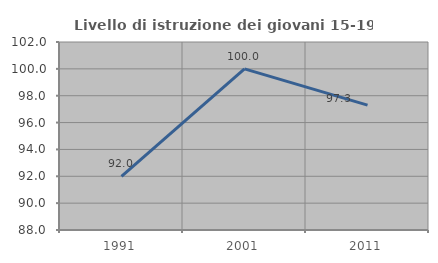
| Category | Livello di istruzione dei giovani 15-19 anni |
|---|---|
| 1991.0 | 92 |
| 2001.0 | 100 |
| 2011.0 | 97.297 |